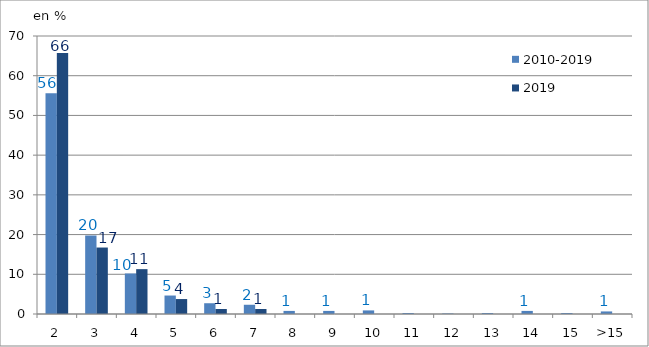
| Category | 2010-2019 | 2019 |
|---|---|---|
| 2 | 55.556 | 65.69 |
| 3 | 19.767 | 16.736 |
| 4 | 10.207 | 11.297 |
| 5 | 4.651 | 3.766 |
| 6 | 2.713 | 1.255 |
| 7 | 2.326 | 1.255 |
| 8 | 0.775 | 0 |
| 9 | 0.775 | 0 |
| 10 | 0.904 | 0 |
| 11 | 0.258 | 0 |
| 12 | 0.129 | 0 |
| 13 | 0.258 | 0 |
| 14 | 0.775 | 0 |
| 15 | 0.258 | 0 |
| >15 | 0.646 | 0 |